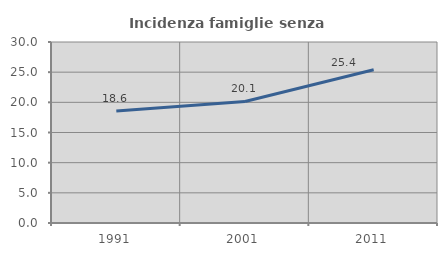
| Category | Incidenza famiglie senza nuclei |
|---|---|
| 1991.0 | 18.554 |
| 2001.0 | 20.14 |
| 2011.0 | 25.405 |